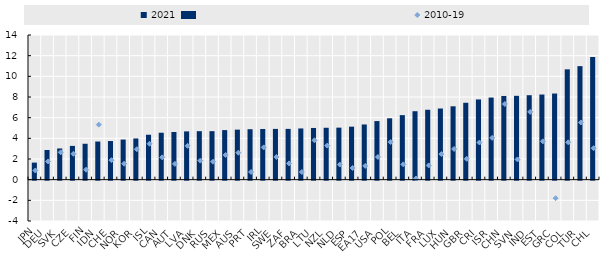
| Category | 2021 |
|---|---|
| JPN | 1.651 |
| DEU | 2.872 |
| SVK | 3.02 |
| CZE | 3.269 |
| FIN | 3.475 |
| IDN | 3.691 |
| CHE | 3.739 |
| NOR | 3.881 |
| KOR | 3.988 |
| ISL | 4.348 |
| CAN | 4.541 |
| AUT | 4.611 |
| LVA | 4.672 |
| DNK | 4.693 |
| RUS | 4.694 |
| MEX | 4.797 |
| AUS | 4.841 |
| PRT | 4.882 |
| IRL | 4.902 |
| SWE | 4.912 |
| ZAF | 4.915 |
| BRA | 4.956 |
| LTU | 5.004 |
| NZL | 5.023 |
| NLD | 5.034 |
| ESP | 5.129 |
| EA17 | 5.342 |
| USA | 5.671 |
| POL | 5.941 |
| BEL | 6.245 |
| ITA | 6.624 |
| FRA | 6.765 |
| LUX | 6.886 |
| HUN | 7.101 |
| GBR | 7.441 |
| CRI | 7.764 |
| ISR | 7.946 |
| CHN | 8.1 |
| SVN | 8.115 |
| IND | 8.174 |
| EST | 8.238 |
| GRC | 8.336 |
| COL | 10.677 |
| TUR | 10.986 |
| CHL | 11.869 |